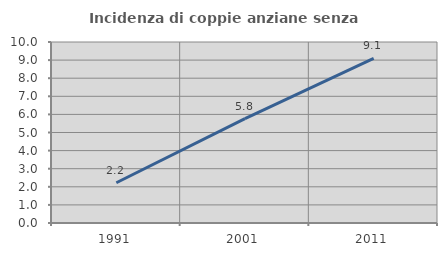
| Category | Incidenza di coppie anziane senza figli  |
|---|---|
| 1991.0 | 2.222 |
| 2001.0 | 5.769 |
| 2011.0 | 9.091 |